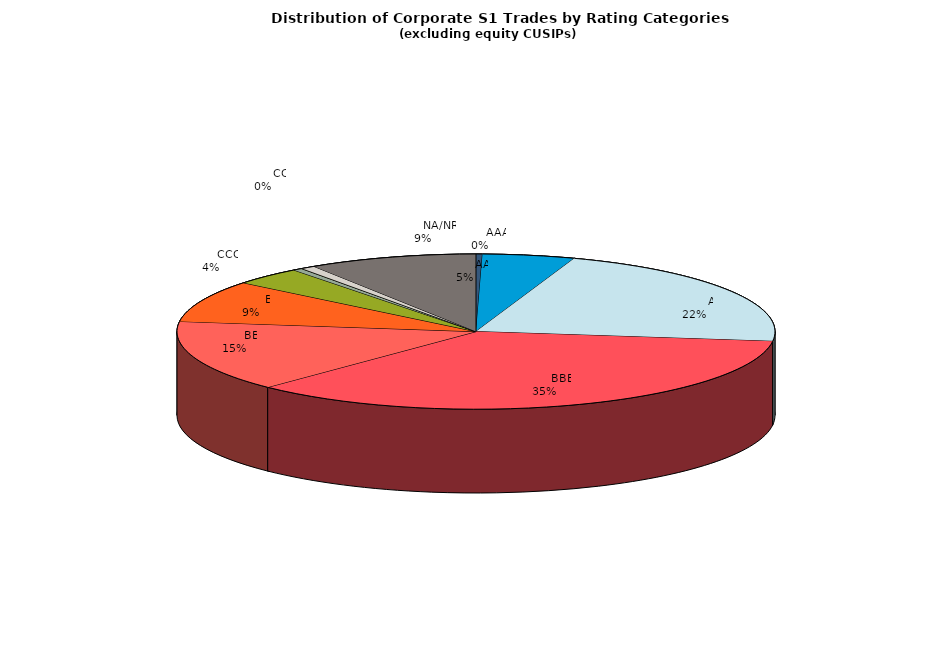
| Category | Series 0 |
|---|---|
|         AAA | 148.016 |
|         AA | 2140.873 |
|         A | 9296.242 |
|         BBB | 15127.012 |
|         BB | 6365.925 |
|         B | 3740.21 |
|         CCC | 1610.706 |
|         CC | 212.857 |
|         C | 23.317 |
|         D | 325.266 |
|         NA/NR | 3910.147 |